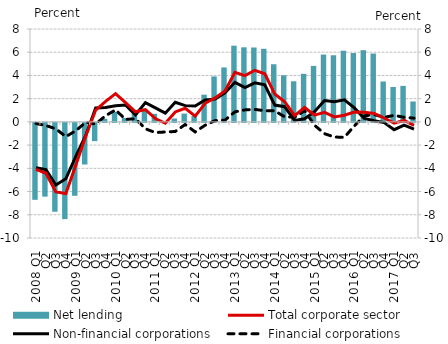
| Category | Net lending |
|---|---|
| 2008 Q1 | -6.624 |
| Q2 | -6.352 |
| Q3 | -7.653 |
| Q4 | -8.291 |
| 2009 Q1 | -6.28 |
| Q2 | -3.583 |
| Q3 | -1.573 |
| Q4 | 0.266 |
| 2010 Q1 | 0.868 |
| Q2 | 0.342 |
| Q3 | 0.707 |
| Q4 | 1.118 |
| 2011 Q1 | 0.698 |
| Q2 | -0.018 |
| Q3 | 0.289 |
| Q4 | 0.713 |
| 2012 Q1 | 0.498 |
| Q2 | 2.345 |
| Q3 | 3.915 |
| Q4 | 4.688 |
| 2013 Q1 | 6.563 |
| Q2 | 6.423 |
| Q3 | 6.408 |
| Q4 | 6.295 |
| 2014 Q1 | 4.965 |
| Q2 | 4.016 |
| Q3 | 3.497 |
| Q4 | 4.141 |
| 2015 Q1 | 4.821 |
| Q2 | 5.799 |
| Q3 | 5.739 |
| Q4 | 6.132 |
| 2016 Q1 | 5.93 |
| Q2 | 6.176 |
| Q3 | 5.886 |
| Q4 | 3.48 |
| 2017 Q1 | 3.003 |
| Q2 | 3.102 |
| Q3 | 1.756 |